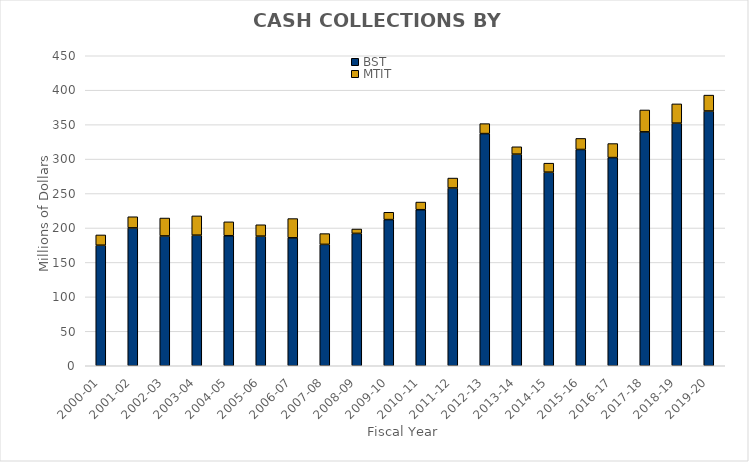
| Category | BST | MTIT |
|---|---|---|
| 2000-01 | 175.004 | 14.896 |
| 2001-02 | 200.103 | 16.207 |
| 2002-03 | 188.421 | 26.013 |
| 2003-04 | 189.55 | 28.001 |
| 2004-05 | 188.77 | 20.155 |
| 2005-06 | 188.152 | 16.505 |
| 2006-07 | 185.706 | 27.939 |
| 2007-08 | 176.198 | 15.641 |
| 2008-09 | 192.142 | 6.363 |
| 2009-10 | 212.143 | 10.659 |
| 2010-11 | 226.524 | 11.107 |
| 2011-12 | 258.048 | 14.414 |
| 2012-13 | 337.007 | 14.47 |
| 2013-14 | 307.194 | 10.68 |
| 2014-15 | 281.002 | 13.078 |
| 2015-16 | 313.952 | 16.045 |
| 2016-17 | 302.203 | 20.341 |
| 2017-18 | 339.534 | 31.78 |
| 2018-19 | 352.162 | 27.976 |
| 2019-20 | 369.784 | 23.102 |